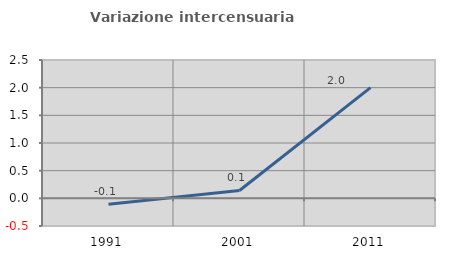
| Category | Variazione intercensuaria annua |
|---|---|
| 1991.0 | -0.105 |
| 2001.0 | 0.142 |
| 2011.0 | 2.002 |